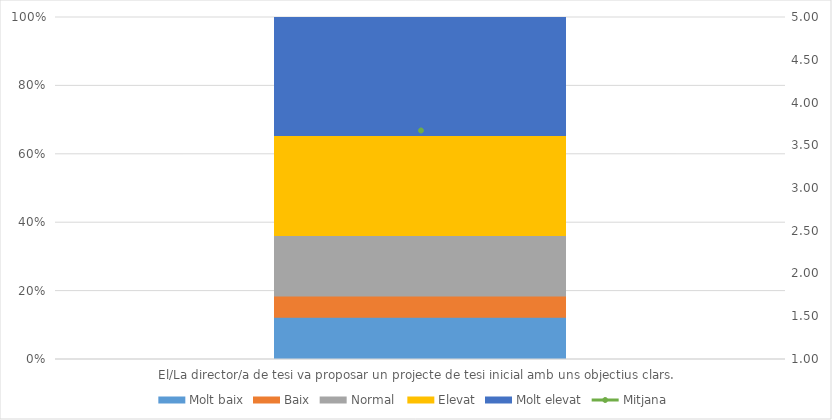
| Category | Molt baix | Baix | Normal  | Elevat | Molt elevat |
|---|---|---|---|---|---|
| El/La director/a de tesi va proposar un projecte de tesi inicial amb uns objectius clars.  | 14 | 7 | 20 | 33 | 39 |